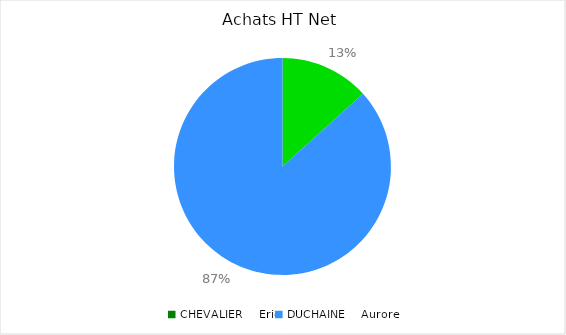
| Category | Achats HT Net |
|---|---|
| CHEVALIER    Eric | 98.4 |
| DUCHAINE    Aurore | 641.25 |